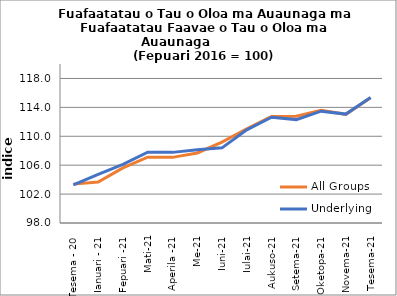
| Category | All Groups | Underlying |
|---|---|---|
| Tesema - 20 | 103.378 | 103.266 |
| Ianuari - 21 | 103.671 | 104.733 |
| Fepuari -21 | 105.627 | 106.099 |
| Mati-21 | 107.11 | 107.788 |
| Aperila -21 | 107.082 | 107.772 |
| Me-21 | 107.693 | 108.128 |
| Iuni-21 | 109.193 | 108.399 |
| Iulai-21 | 111.039 | 110.883 |
| Aukuso-21 | 112.735 | 112.633 |
| Setema-21 | 112.778 | 112.306 |
| Oketopa-21 | 113.609 | 113.469 |
| Novema-21 | 113.04 | 113.069 |
| Tesema-21 | 115.332 | 115.373 |